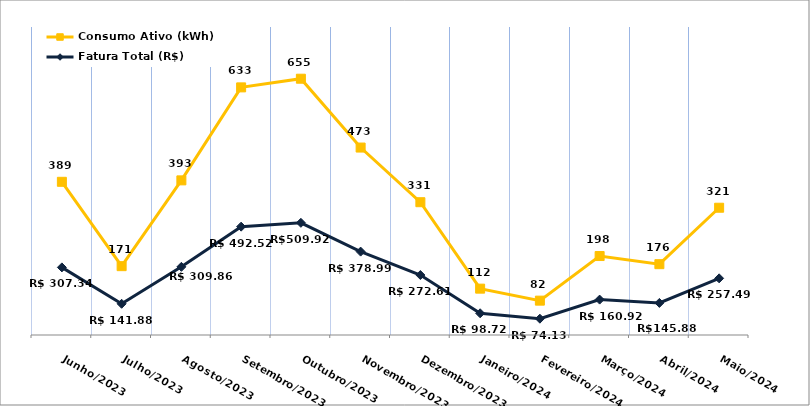
| Category | Fatura Total (R$) | Consumo Ativo (kWh) |
|---|---|---|
| Junho/2023 | 307.34 | 389 |
| Julho/2023 | 141.88 | 171 |
| Agosto/2023 | 309.86 | 393 |
| Setembro/2023 | 492.52 | 633 |
| Outubro/2023 | 509.92 | 655 |
| Novembro/2023 | 378.99 | 473 |
| Dezembro/2023 | 272.61 | 331 |
| Janeiro/2024 | 98.72 | 112 |
| Fevereiro/2024 | 74.13 | 82 |
| Março/2024 | 160.92 | 198 |
| Abril/2024 | 145.88 | 176 |
| Maio/2024 | 257.49 | 321 |